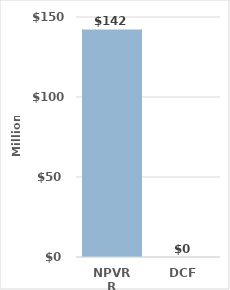
| Category | Series 0 |
|---|---|
| NPVRR | 142.26 |
| DCF | 0 |